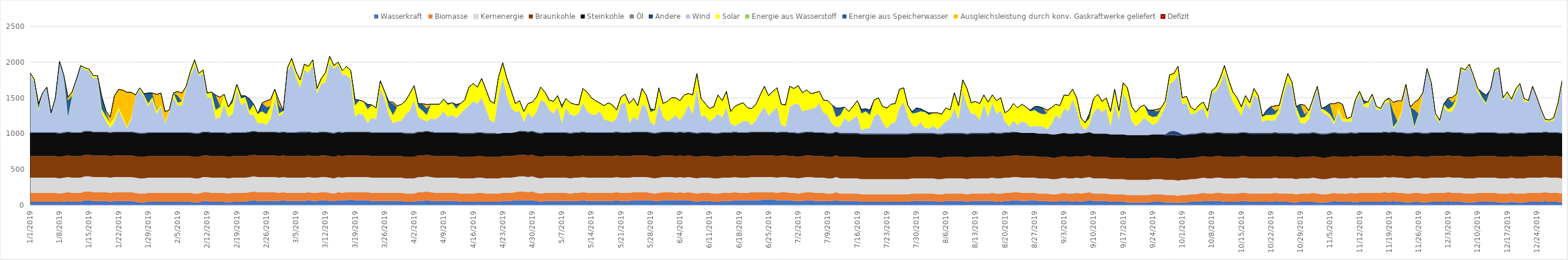
| Category | Wasserkraft | Biomasse | Kernenergie | Braunkohle | Steinkohle | Öl | Andere | Wind | Solar | Energie aus Wasserstoff | Energie aus Speicherwasser | Ausgleichsleistung durch konv. Gaskraftwerke geliefert | Defizit |
|---|---|---|---|---|---|---|---|---|---|---|---|---|---|
| 1/1/19 | 50 | 130 | 205.632 | 300.384 | 325.872 | 1.046 | 10 | 820 | 10 | 0 | 0 | 0 | 0 |
| 1/2/19 | 50 | 130 | 205.632 | 300.384 | 325.872 | 1.046 | 10 | 700 | 40 | 0 | 0 | 0 | 0 |
| 1/3/19 | 50 | 130 | 205.632 | 300.384 | 325.872 | 1.046 | 10 | 300 | 30 | 0 | 67.066 | 0 | 0 |
| 1/4/19 | 50 | 130 | 205.632 | 300.384 | 325.872 | 1.046 | 10 | 540 | 10 | 0 | 0 | 0 | 0 |
| 1/5/19 | 50 | 130 | 205.632 | 300.384 | 325.872 | 1.046 | 10 | 620 | 10 | 0 | 0 | 0 | 0 |
| 1/6/19 | 50 | 130 | 205.632 | 300.384 | 325.872 | 1.046 | 10 | 260 | 10 | 0 | 0 | 0 | 0 |
| 1/7/19 | 50 | 130 | 205.632 | 300.384 | 325.872 | 1.046 | 10 | 450 | 10 | 0 | 17.066 | 0 | 0 |
| 1/8/19 | 50 | 120 | 205.632 | 300.384 | 325.872 | 1.046 | 10 | 980 | 20 | 0 | 0 | 0 | 0 |
| 1/9/19 | 50 | 130 | 205.632 | 300.384 | 325.872 | 1.046 | 10 | 790 | 10 | 0 | 0 | 0 | 0 |
| 1/10/19 | 60 | 130 | 205.632 | 300.384 | 325.872 | 1.046 | 10 | 190 | 10 | 0 | 235.44 | 41.626 | 0 |
| 1/11/19 | 50 | 130 | 205.632 | 300.384 | 325.872 | 1.046 | 10 | 500 | 10 | 0 | 0 | 57.066 | 0 |
| 1/12/19 | 50 | 130 | 205.632 | 300.384 | 325.872 | 1.046 | 10 | 730 | 10 | 0 | 0 | 0 | 0 |
| 1/13/19 | 50 | 130 | 205.632 | 300.384 | 325.872 | 1.046 | 10 | 920 | 10 | 0 | 0 | 0 | 0 |
| 1/14/19 | 70 | 130 | 205.632 | 300.384 | 325.872 | 1.046 | 10 | 850 | 30 | 0 | 0 | 0 | 0 |
| 1/15/19 | 70 | 130 | 205.632 | 300.384 | 325.872 | 1.046 | 10 | 840 | 20 | 0 | 0 | 0 | 0 |
| 1/16/19 | 60 | 130 | 205.632 | 300.384 | 325.872 | 1.046 | 10 | 740 | 40 | 0 | 0 | 0 | 0 |
| 1/17/19 | 60 | 130 | 205.632 | 300.384 | 325.872 | 1.046 | 10 | 760 | 20 | 0 | 0 | 0 | 0 |
| 1/18/19 | 60 | 130 | 205.632 | 300.384 | 325.872 | 1.046 | 10 | 260 | 50 | 0 | 177.066 | 0 | 0 |
| 1/19/19 | 60 | 130 | 205.632 | 300.384 | 325.872 | 1.046 | 10 | 140 | 70 | 0 | 58.374 | 18.691 | 0 |
| 1/20/19 | 50 | 130 | 205.632 | 300.384 | 325.872 | 1.046 | 10 | 60 | 60 | 0 | 0 | 87.066 | 0 |
| 1/21/19 | 60 | 130 | 205.632 | 300.384 | 325.872 | 1.046 | 10 | 130 | 60 | 0 | 0 | 307.066 | 0 |
| 1/22/19 | 60 | 130 | 205.632 | 300.384 | 325.872 | 1.046 | 10 | 300 | 40 | 0 | 0 | 247.066 | 0 |
| 1/23/19 | 60 | 130 | 205.632 | 300.384 | 325.872 | 1.046 | 10 | 170 | 30 | 0 | 0 | 377.066 | 0 |
| 1/24/19 | 60 | 130 | 205.632 | 300.384 | 325.872 | 1.046 | 10 | 50 | 20 | 0 | 0 | 477.066 | 0 |
| 1/25/19 | 60 | 130 | 205.632 | 300.384 | 325.872 | 1.046 | 10 | 180 | 20 | 0 | 0 | 347.066 | 0 |
| 1/26/19 | 50 | 130 | 205.632 | 300.384 | 325.872 | 1.046 | 10 | 510 | 10 | 0 | 0 | 0 | 0 |
| 1/27/19 | 40 | 130 | 205.632 | 300.384 | 325.872 | 1.046 | 10 | 600 | 30 | 0 | 0 | 0 | 0 |
| 1/28/19 | 40 | 130 | 205.632 | 300.384 | 325.872 | 1.046 | 10 | 500 | 30 | 0 | 17.066 | 0 | 0 |
| 1/29/19 | 50 | 130 | 205.632 | 300.384 | 325.872 | 1.046 | 10 | 360 | 40 | 0 | 147.066 | 0 | 0 |
| 1/30/19 | 50 | 130 | 205.632 | 300.384 | 325.872 | 1.046 | 10 | 450 | 40 | 0 | 57.066 | 0 | 0 |
| 1/31/19 | 50 | 130 | 205.632 | 300.384 | 325.872 | 1.046 | 10 | 250 | 60 | 0 | 14.243 | 202.822 | 0 |
| 2/1/19 | 50 | 130 | 205.632 | 300.384 | 325.872 | 1.046 | 10 | 360 | 20 | 0 | 0 | 167.066 | 0 |
| 2/2/19 | 50 | 130 | 205.632 | 300.384 | 325.872 | 1.046 | 10 | 120 | 20 | 0 | 0 | 147.066 | 0 |
| 2/3/19 | 50 | 130 | 205.632 | 300.384 | 325.872 | 1.046 | 10 | 290 | 20 | 0 | 0 | 0 | 0 |
| 2/4/19 | 50 | 130 | 205.632 | 300.384 | 325.872 | 1.046 | 10 | 490 | 60 | 0 | 0 | 0 | 0 |
| 2/5/19 | 50 | 130 | 205.632 | 300.384 | 325.872 | 1.046 | 10 | 370 | 40 | 0 | 100.695 | 56.371 | 0 |
| 2/6/19 | 50 | 130 | 205.632 | 300.384 | 325.872 | 1.046 | 10 | 370 | 60 | 0 | 0 | 117.066 | 0 |
| 2/7/19 | 50 | 130 | 205.632 | 300.384 | 325.872 | 1.046 | 10 | 610 | 30 | 0 | 0 | 0 | 0 |
| 2/8/19 | 50 | 130 | 205.632 | 300.384 | 325.872 | 1.046 | 10 | 790 | 60 | 0 | 0 | 0 | 0 |
| 2/9/19 | 40 | 130 | 205.632 | 300.384 | 325.872 | 1.046 | 10 | 950 | 70 | 0 | 0 | 0 | 0 |
| 2/10/19 | 40 | 130 | 205.632 | 300.384 | 325.872 | 1.046 | 10 | 800 | 30 | 0 | 0 | 0 | 0 |
| 2/11/19 | 60 | 130 | 205.632 | 300.384 | 325.872 | 1.046 | 10 | 810 | 50 | 0 | 0 | 0 | 0 |
| 2/12/19 | 60 | 130 | 205.632 | 300.384 | 325.872 | 1.046 | 10 | 480 | 50 | 0 | 7.066 | 0 | 0 |
| 2/13/19 | 50 | 130 | 205.632 | 300.384 | 325.872 | 1.046 | 10 | 480 | 80 | 0 | 0 | 0 | 0 |
| 2/14/19 | 50 | 130 | 205.632 | 300.384 | 325.872 | 1.046 | 10 | 190 | 120 | 0 | 207.066 | 0 | 0 |
| 2/15/19 | 50 | 130 | 205.632 | 300.384 | 325.872 | 1.046 | 10 | 210 | 140 | 0 | 23.656 | 113.409 | 0 |
| 2/16/19 | 50 | 130 | 205.632 | 300.384 | 325.872 | 1.046 | 10 | 390 | 140 | 0 | 0 | 0 | 0 |
| 2/17/19 | 40 | 130 | 205.632 | 300.384 | 325.872 | 1.046 | 10 | 220 | 140 | 0 | 0 | 0 | 0 |
| 2/18/19 | 50 | 130 | 205.632 | 300.384 | 325.872 | 1.046 | 10 | 260 | 150 | 0 | 47.066 | 0 | 0 |
| 2/19/19 | 50 | 130 | 205.632 | 300.384 | 325.872 | 1.046 | 10 | 590 | 80 | 0 | 0 | 0 | 0 |
| 2/20/19 | 50 | 130 | 205.632 | 300.384 | 325.872 | 1.046 | 10 | 380 | 90 | 0 | 37.066 | 0 | 0 |
| 2/21/19 | 50 | 130 | 205.632 | 300.384 | 325.872 | 1.046 | 10 | 420 | 70 | 0 | 17.066 | 0 | 0 |
| 2/22/19 | 60 | 130 | 205.632 | 300.384 | 325.872 | 1.046 | 10 | 240 | 50 | 0 | 167.066 | 0 | 0 |
| 2/23/19 | 70 | 130 | 205.632 | 300.384 | 325.872 | 1.046 | 10 | 220 | 150 | 0 | 0 | 0 | 0 |
| 2/24/19 | 60 | 130 | 205.632 | 300.384 | 325.872 | 1.046 | 10 | 110 | 140 | 0 | 0 | 0 | 0 |
| 2/25/19 | 60 | 130 | 205.632 | 300.384 | 325.872 | 1.046 | 10 | 120 | 160 | 0 | 117.066 | 0 | 0 |
| 2/26/19 | 60 | 130 | 205.632 | 300.384 | 325.872 | 1.046 | 10 | 90 | 150 | 0 | 101.873 | 85.193 | 0 |
| 2/27/19 | 60 | 130 | 205.632 | 300.384 | 325.872 | 1.046 | 10 | 180 | 170 | 0 | 0 | 97.066 | 0 |
| 2/28/19 | 60 | 130 | 205.632 | 300.384 | 325.872 | 1.046 | 10 | 450 | 140 | 0 | 0 | 0 | 0 |
| 3/1/19 | 60 | 120 | 205.632 | 300.384 | 325.872 | 1.046 | 10 | 220 | 40 | 0 | 114.348 | 62.718 | 0 |
| 3/2/19 | 70 | 120 | 205.632 | 300.384 | 325.872 | 1.046 | 10 | 250 | 40 | 0 | 0 | 0 | 0 |
| 3/3/19 | 60 | 120 | 205.632 | 300.384 | 325.872 | 1.046 | 10 | 850 | 50 | 0 | 0 | 0 | 0 |
| 3/4/19 | 60 | 120 | 205.632 | 300.384 | 325.872 | 1.046 | 10 | 960 | 70 | 0 | 0 | 0 | 0 |
| 3/5/19 | 60 | 120 | 205.632 | 300.384 | 325.872 | 1.046 | 10 | 770 | 80 | 0 | 0 | 0 | 0 |
| 3/6/19 | 60 | 120 | 205.632 | 300.384 | 325.872 | 1.046 | 20 | 610 | 110 | 0 | 0 | 0 | 0 |
| 3/7/19 | 60 | 120 | 205.632 | 300.384 | 325.872 | 1.046 | 20 | 860 | 80 | 0 | 0 | 0 | 0 |
| 3/8/19 | 70 | 120 | 205.632 | 300.384 | 325.872 | 1.046 | 10 | 820 | 90 | 0 | 0 | 0 | 0 |
| 3/9/19 | 60 | 120 | 205.632 | 300.384 | 325.872 | 1.046 | 10 | 940 | 70 | 0 | 0 | 0 | 0 |
| 3/10/19 | 60 | 120 | 205.632 | 300.384 | 325.872 | 1.046 | 10 | 550 | 60 | 0 | 0 | 0 | 0 |
| 3/11/19 | 70 | 120 | 205.632 | 300.384 | 325.872 | 1.046 | 10 | 660 | 80 | 0 | 0 | 0 | 0 |
| 3/12/19 | 70 | 120 | 205.632 | 300.384 | 325.872 | 1.046 | 10 | 690 | 130 | 0 | 0 | 0 | 0 |
| 3/13/19 | 60 | 120 | 205.632 | 300.384 | 325.872 | 1.046 | 10 | 970 | 90 | 0 | 0 | 0 | 0 |
| 3/14/19 | 60 | 110 | 205.632 | 300.384 | 325.872 | 1.046 | 10 | 900 | 40 | 0 | 0 | 0 | 0 |
| 3/15/19 | 70 | 120 | 205.632 | 300.384 | 325.872 | 1.046 | 10 | 930 | 40 | 0 | 0 | 0 | 0 |
| 3/16/19 | 70 | 110 | 205.632 | 300.384 | 325.872 | 1.046 | 10 | 800 | 60 | 0 | 0 | 0 | 0 |
| 3/17/19 | 70 | 120 | 205.632 | 300.384 | 325.872 | 1.046 | 10 | 790 | 120 | 0 | 0 | 0 | 0 |
| 3/18/19 | 80 | 110 | 205.632 | 300.384 | 325.872 | 1.046 | 10 | 730 | 120 | 0 | 0 | 0 | 0 |
| 3/19/19 | 70 | 120 | 205.632 | 300.384 | 325.872 | 1.046 | 10 | 210 | 150 | 0 | 87.066 | 0 | 0 |
| 3/20/19 | 70 | 120 | 205.632 | 300.384 | 325.872 | 1.046 | 10 | 250 | 180 | 0 | 7.066 | 0 | 0 |
| 3/21/19 | 70 | 120 | 205.632 | 300.384 | 325.872 | 1.046 | 10 | 230 | 190 | 0 | 0 | 0 | 0 |
| 3/22/19 | 70 | 120 | 205.632 | 300.384 | 325.872 | 1.046 | 10 | 120 | 190 | 0 | 67.066 | 0 | 0 |
| 3/23/19 | 60 | 120 | 205.632 | 300.384 | 325.872 | 1.046 | 10 | 200 | 180 | 0 | 0 | 0 | 0 |
| 3/24/19 | 60 | 120 | 205.632 | 300.384 | 325.872 | 1.046 | 10 | 180 | 160 | 0 | 0 | 0 | 0 |
| 3/25/19 | 60 | 120 | 205.632 | 300.384 | 325.872 | 1.046 | 10 | 600 | 120 | 0 | 0 | 0 | 0 |
| 3/26/19 | 60 | 120 | 205.632 | 300.384 | 325.872 | 1.046 | 10 | 470 | 100 | 0 | 0 | 0 | 0 |
| 3/27/19 | 60 | 120 | 205.632 | 300.384 | 325.872 | 1.046 | 10 | 250 | 100 | 0 | 77.066 | 0 | 0 |
| 3/28/19 | 60 | 120 | 205.632 | 300.384 | 325.872 | 1.046 | 10 | 120 | 120 | 0 | 158.374 | 18.691 | 0 |
| 3/29/19 | 60 | 120 | 205.632 | 300.384 | 325.872 | 1.046 | 10 | 150 | 200 | 0 | 0 | 17.066 | 0 |
| 3/30/19 | 60 | 120 | 205.632 | 300.384 | 325.872 | 1.046 | 10 | 160 | 230 | 0 | 0 | 0 | 0 |
| 3/31/19 | 50 | 120 | 205.632 | 300.384 | 325.872 | 1.046 | 10 | 260 | 190 | 0 | 0 | 0 | 0 |
| 4/1/19 | 50 | 120 | 205.632 | 300.384 | 325.872 | 1.046 | 10 | 310 | 240 | 0 | 0 | 0 | 0 |
| 4/2/19 | 50 | 120 | 205.632 | 300.384 | 325.872 | 1.046 | 10 | 460 | 200 | 0 | 0 | 0 | 0 |
| 4/3/19 | 60 | 130 | 205.632 | 300.384 | 325.872 | 1.046 | 10 | 200 | 140 | 0 | 47.066 | 0 | 0 |
| 4/4/19 | 60 | 130 | 205.632 | 300.384 | 325.872 | 1.046 | 10 | 170 | 120 | 0 | 97.066 | 0 | 0 |
| 4/5/19 | 70 | 130 | 205.632 | 300.384 | 325.872 | 1.046 | 10 | 130 | 90 | 0 | 91.309 | 55.757 | 0 |
| 4/6/19 | 60 | 130 | 205.632 | 300.384 | 325.872 | 1.046 | 10 | 180 | 200 | 0 | 0 | 0 | 0 |
| 4/7/19 | 60 | 120 | 205.632 | 300.384 | 325.872 | 1.046 | 10 | 180 | 210 | 0 | 0 | 0 | 0 |
| 4/8/19 | 60 | 120 | 205.632 | 300.384 | 325.872 | 1.046 | 10 | 220 | 170 | 0 | 0 | 0 | 0 |
| 4/9/19 | 60 | 120 | 205.632 | 300.384 | 325.872 | 1.046 | 10 | 290 | 170 | 0 | 0 | 0 | 0 |
| 4/10/19 | 60 | 120 | 205.632 | 300.384 | 325.872 | 1.046 | 10 | 210 | 170 | 0 | 17.066 | 0 | 0 |
| 4/11/19 | 60 | 120 | 205.632 | 300.384 | 325.872 | 1.046 | 10 | 240 | 170 | 0 | 0 | 0 | 0 |
| 4/12/19 | 60 | 120 | 205.632 | 300.384 | 325.872 | 1.046 | 10 | 200 | 130 | 0 | 57.066 | 0 | 0 |
| 4/13/19 | 50 | 120 | 205.632 | 300.384 | 325.872 | 1.046 | 10 | 270 | 140 | 0 | 0 | 0 | 0 |
| 4/14/19 | 50 | 120 | 205.632 | 300.384 | 325.872 | 1.046 | 10 | 330 | 130 | 0 | 0 | 0 | 0 |
| 4/15/19 | 50 | 120 | 205.632 | 300.384 | 325.872 | 1.046 | 10 | 380 | 260 | 0 | 0 | 0 | 0 |
| 4/16/19 | 50 | 120 | 205.632 | 300.384 | 325.872 | 1.046 | 10 | 440 | 250 | 0 | 0 | 0 | 0 |
| 4/17/19 | 50 | 130 | 205.632 | 300.384 | 325.872 | 1.046 | 10 | 400 | 230 | 0 | 0 | 0 | 0 |
| 4/18/19 | 50 | 130 | 205.632 | 300.384 | 325.872 | 1.046 | 10 | 480 | 270 | 0 | 0 | 0 | 0 |
| 4/19/19 | 50 | 120 | 205.632 | 300.384 | 325.872 | 1.046 | 10 | 340 | 270 | 0 | 0 | 0 | 0 |
| 4/20/19 | 50 | 120 | 205.632 | 300.384 | 325.872 | 1.046 | 10 | 180 | 270 | 0 | 0 | 0 | 0 |
| 4/21/19 | 50 | 120 | 205.632 | 300.384 | 325.872 | 1.046 | 10 | 140 | 270 | 0 | 0 | 0 | 0 |
| 4/22/19 | 50 | 120 | 205.632 | 300.384 | 325.872 | 1.046 | 0 | 520 | 270 | 0 | 0 | 0 | 0 |
| 4/23/19 | 60 | 120 | 205.632 | 300.384 | 325.872 | 1.046 | 0 | 770 | 210 | 0 | 0 | 0 | 0 |
| 4/24/19 | 60 | 120 | 205.632 | 300.384 | 325.872 | 1.046 | 0 | 520 | 240 | 0 | 0 | 0 | 0 |
| 4/25/19 | 60 | 120 | 205.632 | 300.384 | 325.872 | 1.046 | 0 | 350 | 240 | 0 | 0 | 0 | 0 |
| 4/26/19 | 70 | 120 | 205.632 | 300.384 | 325.872 | 1.046 | 0 | 280 | 120 | 0 | 0 | 0 | 0 |
| 4/27/19 | 70 | 130 | 205.632 | 300.384 | 325.872 | 1.046 | 10 | 280 | 140 | 0 | 0 | 0 | 0 |
| 4/28/19 | 70 | 130 | 205.632 | 300.384 | 325.872 | 1.046 | 10 | 120 | 150 | 0 | 0 | 0 | 0 |
| 4/29/19 | 70 | 120 | 205.632 | 300.384 | 325.872 | 1.046 | 10 | 270 | 120 | 0 | 0 | 0 | 0 |
| 4/30/19 | 70 | 130 | 205.632 | 300.384 | 325.872 | 1.046 | 10 | 180 | 220 | 0 | 0 | 0 | 0 |
| 5/1/19 | 60 | 120 | 205.632 | 300.384 | 325.872 | 1.046 | 10 | 280 | 210 | 0 | 0 | 0 | 0 |
| 5/2/19 | 50 | 120 | 205.632 | 300.384 | 325.872 | 1.046 | 10 | 460 | 180 | 0 | 0 | 0 | 0 |
| 5/3/19 | 60 | 120 | 205.632 | 300.384 | 325.872 | 1.046 | 10 | 420 | 140 | 0 | 0 | 0 | 0 |
| 5/4/19 | 60 | 120 | 205.632 | 300.384 | 325.872 | 1.046 | 10 | 320 | 130 | 0 | 0 | 0 | 0 |
| 5/5/19 | 60 | 120 | 205.632 | 300.384 | 325.872 | 1.046 | 10 | 260 | 170 | 0 | 0 | 0 | 0 |
| 5/6/19 | 60 | 120 | 205.632 | 300.384 | 325.872 | 1.046 | 10 | 350 | 160 | 0 | 0 | 0 | 0 |
| 5/7/19 | 60 | 120 | 205.632 | 300.384 | 325.872 | 1.046 | 10 | 130 | 200 | 0 | 37.066 | 0 | 0 |
| 5/8/19 | 60 | 120 | 205.632 | 300.384 | 325.872 | 1.046 | 10 | 340 | 130 | 0 | 0 | 0 | 0 |
| 5/9/19 | 60 | 110 | 205.632 | 300.384 | 325.872 | 1.046 | 10 | 260 | 160 | 0 | 0 | 0 | 0 |
| 5/10/19 | 60 | 120 | 205.632 | 300.384 | 325.872 | 1.046 | 10 | 230 | 160 | 0 | 0 | 0 | 0 |
| 5/11/19 | 60 | 120 | 205.632 | 300.384 | 325.872 | 1.046 | 10 | 260 | 120 | 0 | 0 | 0 | 0 |
| 5/12/19 | 70 | 120 | 205.632 | 300.384 | 325.872 | 1.046 | 10 | 400 | 200 | 0 | 0 | 0 | 0 |
| 5/13/19 | 60 | 120 | 205.632 | 300.384 | 325.872 | 1.046 | 10 | 290 | 270 | 0 | 0 | 0 | 0 |
| 5/14/19 | 60 | 120 | 205.632 | 300.384 | 325.872 | 1.046 | 10 | 250 | 230 | 0 | 0 | 0 | 0 |
| 5/15/19 | 60 | 120 | 205.632 | 300.384 | 325.872 | 1.046 | 10 | 240 | 200 | 0 | 0 | 0 | 0 |
| 5/16/19 | 60 | 120 | 205.632 | 300.384 | 325.872 | 1.046 | 10 | 290 | 110 | 0 | 7.066 | 0 | 0 |
| 5/17/19 | 60 | 120 | 205.632 | 300.384 | 325.872 | 1.046 | 10 | 180 | 190 | 0 | 0 | 0 | 0 |
| 5/18/19 | 60 | 120 | 205.632 | 300.384 | 325.872 | 1.046 | 10 | 160 | 250 | 0 | 0 | 0 | 0 |
| 5/19/19 | 60 | 120 | 205.632 | 300.384 | 325.872 | 1.046 | 10 | 140 | 240 | 0 | 0 | 0 | 0 |
| 5/20/19 | 70 | 120 | 205.632 | 300.384 | 325.872 | 1.046 | 10 | 190 | 110 | 0 | 0 | 0 | 0 |
| 5/21/19 | 60 | 120 | 205.632 | 300.384 | 325.872 | 1.046 | 10 | 390 | 100 | 0 | 0 | 0 | 0 |
| 5/22/19 | 60 | 120 | 205.632 | 300.384 | 325.872 | 1.046 | 10 | 420 | 110 | 0 | 0 | 0 | 0 |
| 5/23/19 | 60 | 120 | 205.632 | 300.384 | 325.872 | 1.046 | 10 | 130 | 270 | 0 | 0 | 0 | 0 |
| 5/24/19 | 70 | 120 | 205.632 | 300.384 | 325.872 | 1.046 | 10 | 200 | 260 | 0 | 0 | 0 | 0 |
| 5/25/19 | 70 | 120 | 205.632 | 300.384 | 325.872 | 1.046 | 10 | 160 | 200 | 0 | 0 | 0 | 0 |
| 5/26/19 | 70 | 120 | 205.632 | 300.384 | 325.872 | 1.046 | 10 | 380 | 220 | 0 | 0 | 0 | 0 |
| 5/27/19 | 70 | 120 | 205.632 | 300.384 | 325.872 | 1.046 | 10 | 340 | 170 | 0 | 0 | 0 | 0 |
| 5/28/19 | 70 | 110 | 205.632 | 300.384 | 325.872 | 1.046 | 10 | 140 | 140 | 0 | 47.066 | 0 | 0 |
| 5/29/19 | 60 | 110 | 205.632 | 300.384 | 325.872 | 1.046 | 10 | 110 | 210 | 0 | 0 | 0 | 0 |
| 5/30/19 | 60 | 120 | 205.632 | 300.384 | 325.872 | 1.046 | 10 | 400 | 220 | 0 | 0 | 0 | 0 |
| 5/31/19 | 70 | 120 | 205.632 | 300.384 | 325.872 | 1.046 | 10 | 200 | 190 | 0 | 0 | 0 | 0 |
| 6/1/19 | 70 | 120 | 205.632 | 300.384 | 325.872 | 1.046 | 10 | 140 | 280 | 0 | 0 | 0 | 0 |
| 6/2/19 | 70 | 120 | 205.632 | 300.384 | 325.872 | 1.046 | 10 | 180 | 290 | 0 | 0 | 0 | 0 |
| 6/3/19 | 70 | 110 | 205.632 | 300.384 | 325.872 | 1.046 | 10 | 240 | 240 | 0 | 0 | 0 | 0 |
| 6/4/19 | 70 | 120 | 205.632 | 300.384 | 325.872 | 1.046 | 10 | 160 | 270 | 0 | 0 | 0 | 0 |
| 6/5/19 | 70 | 110 | 205.632 | 300.384 | 325.872 | 1.046 | 10 | 250 | 270 | 0 | 0 | 0 | 0 |
| 6/6/19 | 70 | 120 | 205.632 | 300.384 | 325.872 | 1.046 | 10 | 380 | 150 | 0 | 0 | 0 | 0 |
| 6/7/19 | 60 | 120 | 205.632 | 300.384 | 325.872 | 1.046 | 10 | 250 | 270 | 0 | 0 | 0 | 0 |
| 6/8/19 | 50 | 120 | 205.632 | 300.384 | 325.872 | 1.046 | 10 | 620 | 210 | 0 | 0 | 0 | 0 |
| 6/9/19 | 60 | 120 | 205.632 | 300.384 | 325.872 | 1.046 | 10 | 220 | 250 | 0 | 0 | 0 | 0 |
| 6/10/19 | 60 | 120 | 205.632 | 300.384 | 325.872 | 1.046 | 10 | 230 | 170 | 0 | 0 | 0 | 0 |
| 6/11/19 | 60 | 120 | 205.632 | 300.384 | 325.872 | 1.046 | 10 | 150 | 180 | 0 | 0 | 0 | 0 |
| 6/12/19 | 50 | 120 | 205.632 | 300.384 | 325.872 | 1.046 | 10 | 200 | 160 | 0 | 7.066 | 0 | 0 |
| 6/13/19 | 50 | 120 | 205.632 | 300.384 | 325.872 | 1.046 | 10 | 270 | 260 | 0 | 0 | 0 | 0 |
| 6/14/19 | 60 | 120 | 205.632 | 300.384 | 325.872 | 1.046 | 10 | 200 | 240 | 0 | 0 | 0 | 0 |
| 6/15/19 | 60 | 120 | 205.632 | 300.384 | 325.872 | 1.046 | 10 | 350 | 220 | 0 | 0 | 0 | 0 |
| 6/16/19 | 60 | 120 | 205.632 | 300.384 | 325.872 | 1.046 | 10 | 120 | 170 | 0 | 0 | 0 | 0 |
| 6/17/19 | 70 | 120 | 205.632 | 300.384 | 325.872 | 1.046 | 10 | 80 | 270 | 0 | 0 | 0 | 0 |
| 6/18/19 | 70 | 110 | 205.632 | 300.384 | 325.872 | 1.046 | 10 | 120 | 270 | 0 | 0 | 0 | 0 |
| 6/19/19 | 70 | 110 | 205.632 | 300.384 | 325.872 | 1.046 | 10 | 150 | 260 | 0 | 0 | 0 | 0 |
| 6/20/19 | 70 | 110 | 205.632 | 300.384 | 325.872 | 1.046 | 10 | 160 | 180 | 0 | 0 | 0 | 0 |
| 6/21/19 | 70 | 120 | 205.632 | 300.384 | 325.872 | 1.046 | 10 | 90 | 230 | 0 | 0 | 0 | 0 |
| 6/22/19 | 70 | 120 | 205.632 | 300.384 | 325.872 | 1.046 | 10 | 160 | 220 | 0 | 0 | 0 | 0 |
| 6/23/19 | 70 | 120 | 205.632 | 300.384 | 325.872 | 1.046 | 10 | 260 | 250 | 0 | 0 | 0 | 0 |
| 6/24/19 | 80 | 110 | 205.632 | 300.384 | 325.872 | 1.046 | 10 | 340 | 290 | 0 | 0 | 0 | 0 |
| 6/25/19 | 80 | 110 | 205.632 | 300.384 | 325.872 | 1.046 | 10 | 220 | 280 | 0 | 0 | 0 | 0 |
| 6/26/19 | 80 | 110 | 205.632 | 300.384 | 325.872 | 1.046 | 10 | 280 | 280 | 0 | 0 | 0 | 0 |
| 6/27/19 | 70 | 110 | 205.632 | 300.384 | 325.872 | 1.046 | 10 | 350 | 270 | 0 | 0 | 0 | 0 |
| 6/28/19 | 70 | 120 | 205.632 | 300.384 | 325.872 | 1.046 | 10 | 90 | 290 | 0 | 0 | 0 | 0 |
| 6/29/19 | 70 | 120 | 205.632 | 300.384 | 325.872 | 1.046 | 10 | 70 | 300 | 0 | 0 | 0 | 0 |
| 6/30/19 | 70 | 110 | 205.632 | 300.384 | 325.872 | 1.046 | 10 | 350 | 290 | 0 | 0 | 0 | 0 |
| 7/1/19 | 60 | 120 | 205.632 | 300.384 | 325.872 | 1.046 | 10 | 390 | 220 | 0 | 0 | 0 | 0 |
| 7/2/19 | 60 | 110 | 205.632 | 300.384 | 325.872 | 1.046 | 10 | 410 | 250 | 0 | 0 | 0 | 0 |
| 7/3/19 | 60 | 120 | 205.632 | 300.384 | 325.872 | 1.046 | 10 | 290 | 260 | 0 | 0 | 0 | 0 |
| 7/4/19 | 70 | 120 | 205.632 | 300.384 | 325.872 | 1.046 | 10 | 300 | 280 | 0 | 0 | 0 | 0 |
| 7/5/19 | 70 | 120 | 205.632 | 300.384 | 325.872 | 1.046 | 10 | 310 | 220 | 0 | 0 | 0 | 0 |
| 7/6/19 | 60 | 120 | 205.632 | 300.384 | 325.872 | 1.046 | 10 | 340 | 210 | 0 | 0 | 0 | 0 |
| 7/7/19 | 60 | 120 | 205.632 | 300.384 | 325.872 | 1.046 | 10 | 400 | 170 | 0 | 0 | 0 | 0 |
| 7/8/19 | 60 | 120 | 205.632 | 300.384 | 325.872 | 1.046 | 10 | 270 | 180 | 0 | 0 | 0 | 0 |
| 7/9/19 | 60 | 110 | 205.632 | 300.384 | 325.872 | 1.046 | 10 | 250 | 200 | 0 | 0 | 0 | 0 |
| 7/10/19 | 60 | 110 | 205.632 | 300.384 | 325.872 | 1.046 | 10 | 130 | 260 | 0 | 0 | 0 | 0 |
| 7/11/19 | 70 | 120 | 205.632 | 300.384 | 325.872 | 1.046 | 10 | 60 | 140 | 0 | 127.066 | 0 | 0 |
| 7/12/19 | 60 | 110 | 205.632 | 300.384 | 325.872 | 1.046 | 10 | 90 | 160 | 0 | 97.066 | 0 | 0 |
| 7/13/19 | 60 | 110 | 205.632 | 300.384 | 325.872 | 1.046 | 10 | 210 | 150 | 0 | 0 | 0 | 0 |
| 7/14/19 | 60 | 110 | 205.632 | 300.384 | 325.872 | 1.046 | 10 | 150 | 150 | 0 | 0 | 0 | 0 |
| 7/15/19 | 60 | 110 | 205.632 | 300.384 | 325.872 | 1.046 | 10 | 200 | 170 | 0 | 0 | 0 | 0 |
| 7/16/19 | 60 | 110 | 205.632 | 300.384 | 325.872 | 1.046 | 10 | 240 | 210 | 0 | 0 | 0 | 0 |
| 7/17/19 | 50 | 110 | 205.632 | 300.384 | 325.872 | 1.046 | 10 | 50 | 230 | 0 | 57.066 | 0 | 0 |
| 7/18/19 | 50 | 110 | 205.632 | 300.384 | 325.872 | 1.046 | 10 | 70 | 240 | 0 | 37.066 | 0 | 0 |
| 7/19/19 | 50 | 110 | 205.632 | 300.384 | 325.872 | 1.046 | 10 | 80 | 180 | 0 | 67.066 | 0 | 0 |
| 7/20/19 | 50 | 110 | 205.632 | 300.384 | 325.872 | 1.046 | 10 | 240 | 230 | 0 | 0 | 0 | 0 |
| 7/21/19 | 50 | 110 | 205.632 | 300.384 | 325.872 | 1.046 | 10 | 280 | 220 | 0 | 0 | 0 | 0 |
| 7/22/19 | 50 | 110 | 205.632 | 300.384 | 325.872 | 1.046 | 10 | 160 | 220 | 0 | 0 | 0 | 0 |
| 7/23/19 | 50 | 110 | 205.632 | 300.384 | 325.872 | 1.046 | 10 | 70 | 280 | 0 | 7.066 | 0 | 0 |
| 7/24/19 | 50 | 110 | 205.632 | 300.384 | 325.872 | 1.046 | 10 | 140 | 270 | 0 | 0 | 0 | 0 |
| 7/25/19 | 50 | 110 | 205.632 | 300.384 | 325.872 | 1.046 | 10 | 160 | 260 | 0 | 0 | 0 | 0 |
| 7/26/19 | 50 | 110 | 205.632 | 300.384 | 325.872 | 1.046 | 10 | 360 | 260 | 0 | 0 | 0 | 0 |
| 7/27/19 | 50 | 110 | 205.632 | 300.384 | 325.872 | 1.046 | 10 | 440 | 200 | 0 | 0 | 0 | 0 |
| 7/28/19 | 50 | 110 | 205.632 | 300.384 | 325.872 | 1.046 | 10 | 240 | 150 | 0 | 0 | 0 | 0 |
| 7/29/19 | 60 | 110 | 205.632 | 300.384 | 325.872 | 1.046 | 10 | 110 | 160 | 0 | 27.066 | 0 | 0 |
| 7/30/19 | 60 | 110 | 205.632 | 300.384 | 325.872 | 1.046 | 10 | 80 | 200 | 0 | 67.066 | 0 | 0 |
| 7/31/19 | 60 | 110 | 205.632 | 300.384 | 325.872 | 1.046 | 10 | 150 | 150 | 0 | 37.066 | 0 | 0 |
| 8/1/19 | 60 | 110 | 205.632 | 300.384 | 325.872 | 1.046 | 10 | 70 | 220 | 0 | 17.066 | 0 | 0 |
| 8/2/19 | 60 | 110 | 205.632 | 300.384 | 325.872 | 1.046 | 10 | 60 | 190 | 0 | 27.066 | 0 | 0 |
| 8/3/19 | 60 | 110 | 205.632 | 300.384 | 325.872 | 1.046 | 10 | 100 | 180 | 0 | 0 | 0 | 0 |
| 8/4/19 | 50 | 110 | 205.632 | 300.384 | 325.872 | 1.046 | 10 | 60 | 230 | 0 | 0 | 0 | 0 |
| 8/5/19 | 50 | 110 | 205.632 | 300.384 | 325.872 | 1.046 | 10 | 110 | 160 | 0 | 0 | 0 | 0 |
| 8/6/19 | 60 | 110 | 205.632 | 300.384 | 325.872 | 1.046 | 10 | 160 | 190 | 0 | 0 | 0 | 0 |
| 8/7/19 | 60 | 110 | 205.632 | 300.384 | 325.872 | 1.046 | 10 | 200 | 120 | 0 | 0 | 0 | 0 |
| 8/8/19 | 60 | 110 | 205.632 | 300.384 | 325.872 | 1.046 | 10 | 340 | 220 | 0 | 0 | 0 | 0 |
| 8/9/19 | 60 | 110 | 205.632 | 300.384 | 325.872 | 1.046 | 10 | 190 | 190 | 0 | 0 | 0 | 0 |
| 8/10/19 | 60 | 110 | 205.632 | 300.384 | 325.872 | 1.046 | 10 | 590 | 150 | 0 | 0 | 0 | 0 |
| 8/11/19 | 50 | 110 | 205.632 | 300.384 | 325.872 | 1.046 | 10 | 400 | 230 | 0 | 0 | 0 | 0 |
| 8/12/19 | 60 | 110 | 205.632 | 300.384 | 325.872 | 1.046 | 10 | 270 | 150 | 0 | 0 | 0 | 0 |
| 8/13/19 | 60 | 110 | 205.632 | 300.384 | 325.872 | 1.046 | 10 | 260 | 180 | 0 | 0 | 0 | 0 |
| 8/14/19 | 60 | 110 | 205.632 | 300.384 | 325.872 | 1.046 | 10 | 180 | 230 | 0 | 0 | 0 | 0 |
| 8/15/19 | 60 | 110 | 205.632 | 300.384 | 325.872 | 1.046 | 10 | 400 | 130 | 0 | 0 | 0 | 0 |
| 8/16/19 | 60 | 110 | 205.632 | 300.384 | 325.872 | 1.046 | 10 | 220 | 210 | 0 | 0 | 0 | 0 |
| 8/17/19 | 60 | 120 | 205.632 | 300.384 | 325.872 | 1.046 | 10 | 410 | 110 | 0 | 0 | 0 | 0 |
| 8/18/19 | 50 | 120 | 205.632 | 300.384 | 325.872 | 1.046 | 10 | 270 | 180 | 0 | 0 | 0 | 0 |
| 8/19/19 | 50 | 120 | 205.632 | 300.384 | 325.872 | 1.046 | 10 | 310 | 180 | 0 | 0 | 0 | 0 |
| 8/20/19 | 60 | 120 | 205.632 | 300.384 | 325.872 | 1.046 | 10 | 150 | 120 | 0 | 0 | 0 | 0 |
| 8/21/19 | 60 | 120 | 205.632 | 300.384 | 325.872 | 1.046 | 10 | 80 | 230 | 0 | 0 | 0 | 0 |
| 8/22/19 | 70 | 120 | 205.632 | 300.384 | 325.872 | 1.046 | 10 | 150 | 240 | 0 | 0 | 0 | 0 |
| 8/23/19 | 70 | 120 | 205.632 | 300.384 | 325.872 | 1.046 | 0 | 100 | 240 | 0 | 0 | 0 | 0 |
| 8/24/19 | 60 | 120 | 205.632 | 300.384 | 325.872 | 1.046 | 0 | 160 | 240 | 0 | 0 | 0 | 0 |
| 8/25/19 | 60 | 120 | 205.632 | 300.384 | 325.872 | 1.046 | 0 | 140 | 220 | 0 | 0 | 0 | 0 |
| 8/26/19 | 70 | 110 | 205.632 | 300.384 | 325.872 | 1.046 | 0 | 80 | 220 | 0 | 17.066 | 0 | 0 |
| 8/27/19 | 70 | 110 | 205.632 | 300.384 | 325.872 | 1.046 | 0 | 100 | 220 | 0 | 47.066 | 0 | 0 |
| 8/28/19 | 60 | 110 | 205.632 | 300.384 | 325.872 | 1.046 | 0 | 100 | 190 | 0 | 87.066 | 0 | 0 |
| 8/29/19 | 60 | 110 | 205.632 | 300.384 | 325.872 | 1.046 | 0 | 100 | 170 | 0 | 84.243 | 2.822 | 0 |
| 8/30/19 | 60 | 110 | 205.632 | 300.384 | 325.872 | 1.046 | 0 | 60 | 220 | 0 | 0 | 47.066 | 0 |
| 8/31/19 | 50 | 110 | 205.632 | 300.384 | 325.872 | 1.046 | 0 | 140 | 230 | 0 | 0 | 0 | 0 |
| 9/1/19 | 50 | 110 | 205.632 | 300.384 | 325.872 | 1.046 | 0 | 270 | 150 | 0 | 0 | 0 | 0 |
| 9/2/19 | 60 | 110 | 205.632 | 300.384 | 325.872 | 1.046 | 0 | 210 | 180 | 0 | 0 | 0 | 0 |
| 9/3/19 | 60 | 120 | 205.632 | 300.384 | 325.872 | 1.046 | 0 | 340 | 190 | 0 | 0 | 0 | 0 |
| 9/4/19 | 60 | 110 | 205.632 | 300.384 | 325.872 | 1.046 | 0 | 310 | 220 | 0 | 0 | 0 | 0 |
| 9/5/19 | 50 | 120 | 205.632 | 300.384 | 325.872 | 1.046 | 0 | 480 | 140 | 0 | 0 | 0 | 0 |
| 9/6/19 | 60 | 120 | 205.632 | 300.384 | 325.872 | 1.046 | 0 | 320 | 170 | 0 | 0 | 0 | 0 |
| 9/7/19 | 50 | 120 | 205.632 | 300.384 | 325.872 | 1.046 | 0 | 120 | 100 | 0 | 0 | 0 | 0 |
| 9/8/19 | 60 | 120 | 205.632 | 300.384 | 325.872 | 1.046 | 0 | 40 | 100 | 0 | 0 | 0 | 0 |
| 9/9/19 | 70 | 120 | 205.632 | 300.384 | 325.872 | 1.046 | 0 | 110 | 80 | 0 | 67.066 | 0 | 0 |
| 9/10/19 | 60 | 110 | 205.632 | 300.384 | 325.872 | 1.046 | 0 | 300 | 190 | 0 | 0 | 0 | 0 |
| 9/11/19 | 60 | 110 | 205.632 | 300.384 | 325.872 | 1.046 | 0 | 360 | 190 | 0 | 0 | 0 | 0 |
| 9/12/19 | 60 | 110 | 205.632 | 300.384 | 325.872 | 1.046 | 0 | 300 | 150 | 0 | 0 | 0 | 0 |
| 9/13/19 | 60 | 110 | 205.632 | 300.384 | 325.872 | 1.046 | 0 | 350 | 150 | 0 | 0 | 0 | 0 |
| 9/14/19 | 50 | 110 | 205.632 | 300.384 | 325.872 | 1.046 | 0 | 110 | 210 | 0 | 0 | 0 | 0 |
| 9/15/19 | 50 | 110 | 205.632 | 300.384 | 325.872 | 1.046 | 0 | 430 | 200 | 0 | 0 | 0 | 0 |
| 9/16/19 | 50 | 110 | 205.632 | 300.384 | 325.872 | 1.046 | 0 | 200 | 120 | 0 | 7.066 | 0 | 0 |
| 9/17/19 | 50 | 110 | 205.632 | 300.384 | 325.872 | 1.046 | 0 | 580 | 140 | 0 | 0 | 0 | 0 |
| 9/18/19 | 40 | 110 | 205.632 | 300.384 | 325.872 | 1.046 | 0 | 470 | 190 | 0 | 0 | 0 | 0 |
| 9/19/19 | 40 | 110 | 205.632 | 300.384 | 325.872 | 1.046 | 0 | 200 | 200 | 0 | 0 | 0 | 0 |
| 9/20/19 | 40 | 110 | 205.632 | 300.384 | 325.872 | 1.046 | 0 | 120 | 190 | 0 | 7.066 | 0 | 0 |
| 9/21/19 | 40 | 110 | 205.632 | 300.384 | 325.872 | 1.046 | 0 | 170 | 220 | 0 | 0 | 0 | 0 |
| 9/22/19 | 40 | 110 | 205.632 | 300.384 | 325.872 | 1.046 | 0 | 240 | 180 | 0 | 0 | 0 | 0 |
| 9/23/19 | 40 | 110 | 205.632 | 300.384 | 325.872 | 1.046 | 0 | 190 | 90 | 0 | 67.066 | 0 | 0 |
| 9/24/19 | 50 | 110 | 205.632 | 300.384 | 325.872 | 1.046 | 0 | 130 | 110 | 0 | 97.066 | 0 | 0 |
| 9/25/19 | 50 | 110 | 205.632 | 300.384 | 325.872 | 1.046 | 0 | 160 | 90 | 0 | 71.309 | 25.757 | 0 |
| 9/26/19 | 50 | 110 | 205.632 | 300.384 | 325.872 | 1.046 | 0 | 270 | 80 | 0 | 0 | 17.066 | 0 |
| 9/27/19 | 40 | 110 | 205.632 | 300.384 | 325.872 | 1.046 | 10 | 390 | 80 | 0 | 0 | 0 | 0 |
| 9/28/19 | 40 | 110 | 205.632 | 300.384 | 325.872 | 1.046 | 50 | 670 | 120 | 0 | 0 | 0 | 0 |
| 9/29/19 | 40 | 110 | 205.632 | 300.384 | 325.872 | 1.046 | 60 | 690 | 110 | 0 | 0 | 0 | 0 |
| 9/30/19 | 30 | 110 | 205.632 | 300.384 | 325.872 | 1.046 | 50 | 810 | 110 | 0 | 0 | 0 | 0 |
| 10/1/19 | 40 | 110 | 205.632 | 300.384 | 325.872 | 1.046 | 10 | 420 | 90 | 0 | 0 | 0 | 0 |
| 10/2/19 | 40 | 110 | 205.632 | 300.384 | 325.872 | 1.046 | 10 | 440 | 90 | 0 | 0 | 0 | 0 |
| 10/3/19 | 50 | 110 | 205.632 | 300.384 | 325.872 | 1.046 | 10 | 270 | 100 | 0 | 0 | 0 | 0 |
| 10/4/19 | 50 | 110 | 205.632 | 300.384 | 325.872 | 1.046 | 10 | 280 | 50 | 0 | 0 | 0 | 0 |
| 10/5/19 | 50 | 120 | 205.632 | 300.384 | 325.872 | 1.046 | 10 | 320 | 70 | 0 | 0 | 0 | 0 |
| 10/6/19 | 60 | 120 | 205.632 | 300.384 | 325.872 | 1.046 | 10 | 340 | 80 | 0 | 0 | 0 | 0 |
| 10/7/19 | 60 | 110 | 205.632 | 300.384 | 325.872 | 1.046 | 10 | 190 | 110 | 0 | 7.066 | 0 | 0 |
| 10/8/19 | 60 | 110 | 205.632 | 300.384 | 325.872 | 1.046 | 10 | 550 | 40 | 0 | 0 | 0 | 0 |
| 10/9/19 | 60 | 120 | 205.632 | 300.384 | 325.872 | 1.046 | 10 | 570 | 60 | 0 | 0 | 0 | 0 |
| 10/10/19 | 60 | 120 | 205.632 | 300.384 | 325.872 | 1.046 | 10 | 670 | 90 | 0 | 0 | 0 | 0 |
| 10/11/19 | 50 | 120 | 205.632 | 300.384 | 325.872 | 1.046 | 10 | 840 | 100 | 0 | 0 | 0 | 0 |
| 10/12/19 | 50 | 120 | 205.632 | 300.384 | 325.872 | 1.046 | 10 | 610 | 130 | 0 | 0 | 0 | 0 |
| 10/13/19 | 50 | 120 | 205.632 | 300.384 | 325.872 | 1.046 | 10 | 440 | 130 | 0 | 0 | 0 | 0 |
| 10/14/19 | 50 | 120 | 205.632 | 300.384 | 325.872 | 1.046 | 10 | 340 | 150 | 0 | 0 | 0 | 0 |
| 10/15/19 | 60 | 120 | 205.632 | 300.384 | 325.872 | 1.046 | 10 | 230 | 110 | 0 | 17.066 | 0 | 0 |
| 10/16/19 | 60 | 120 | 205.632 | 300.384 | 325.872 | 1.046 | 10 | 420 | 90 | 0 | 0 | 0 | 0 |
| 10/17/19 | 50 | 120 | 205.632 | 300.384 | 325.872 | 1.046 | 10 | 330 | 90 | 0 | 0 | 0 | 0 |
| 10/18/19 | 50 | 120 | 205.632 | 300.384 | 325.872 | 1.046 | 10 | 530 | 90 | 0 | 0 | 0 | 0 |
| 10/19/19 | 50 | 120 | 205.632 | 300.384 | 325.872 | 1.046 | 10 | 470 | 50 | 0 | 0 | 0 | 0 |
| 10/20/19 | 50 | 120 | 205.632 | 300.384 | 325.872 | 1.046 | 10 | 150 | 80 | 0 | 0 | 0 | 0 |
| 10/21/19 | 50 | 120 | 205.632 | 300.384 | 325.872 | 1.046 | 10 | 180 | 70 | 0 | 67.066 | 0 | 0 |
| 10/22/19 | 50 | 120 | 205.632 | 300.384 | 325.872 | 1.046 | 10 | 170 | 80 | 0 | 117.066 | 0 | 0 |
| 10/23/19 | 60 | 120 | 205.632 | 300.384 | 325.872 | 1.046 | 10 | 170 | 80 | 0 | 51.309 | 65.757 | 0 |
| 10/24/19 | 50 | 120 | 205.632 | 300.384 | 325.872 | 1.046 | 10 | 270 | 70 | 0 | 0 | 47.066 | 0 |
| 10/25/19 | 50 | 120 | 205.632 | 300.384 | 325.872 | 1.046 | 10 | 530 | 90 | 0 | 0 | 0 | 0 |
| 10/26/19 | 50 | 120 | 205.632 | 300.384 | 325.872 | 1.046 | 10 | 720 | 110 | 0 | 0 | 0 | 0 |
| 10/27/19 | 40 | 130 | 205.632 | 300.384 | 325.872 | 1.046 | 10 | 640 | 70 | 0 | 0 | 0 | 0 |
| 10/28/19 | 40 | 120 | 205.632 | 300.384 | 325.872 | 1.046 | 10 | 290 | 80 | 0 | 7.066 | 0 | 0 |
| 10/29/19 | 50 | 120 | 205.632 | 300.384 | 325.872 | 1.046 | 10 | 140 | 70 | 0 | 187.066 | 0 | 0 |
| 10/30/19 | 50 | 120 | 205.632 | 300.384 | 325.872 | 1.046 | 10 | 130 | 90 | 0 | 41.309 | 125.757 | 0 |
| 10/31/19 | 50 | 120 | 205.632 | 300.384 | 325.872 | 1.046 | 10 | 190 | 120 | 0 | 0 | 0 | 0 |
| 11/1/19 | 50 | 130 | 205.632 | 300.384 | 325.872 | 1.046 | 10 | 430 | 40 | 0 | 0 | 0 | 0 |
| 11/2/19 | 40 | 130 | 205.632 | 300.384 | 325.872 | 1.046 | 10 | 600 | 50 | 0 | 0 | 0 | 0 |
| 11/3/19 | 40 | 120 | 205.632 | 300.384 | 325.872 | 1.046 | 10 | 310 | 40 | 0 | 0 | 0 | 0 |
| 11/4/19 | 40 | 120 | 205.632 | 300.384 | 325.872 | 1.046 | 10 | 270 | 50 | 0 | 57.066 | 0 | 0 |
| 11/5/19 | 50 | 120 | 205.632 | 300.384 | 325.872 | 1.046 | 10 | 220 | 40 | 0 | 147.066 | 0 | 0 |
| 11/6/19 | 60 | 120 | 205.632 | 300.384 | 325.872 | 1.046 | 10 | 110 | 40 | 0 | 31.309 | 215.757 | 0 |
| 11/7/19 | 50 | 120 | 205.632 | 300.384 | 325.872 | 1.046 | 10 | 290 | 60 | 0 | 0 | 77.066 | 0 |
| 11/8/19 | 50 | 120 | 205.632 | 300.384 | 325.872 | 1.046 | 10 | 160 | 40 | 0 | 0 | 197.066 | 0 |
| 11/9/19 | 50 | 120 | 205.632 | 300.384 | 325.872 | 1.046 | 10 | 160 | 40 | 0 | 0 | 0 | 0 |
| 11/10/19 | 50 | 130 | 205.632 | 300.384 | 325.872 | 1.046 | 10 | 140 | 70 | 0 | 0 | 0 | 0 |
| 11/11/19 | 40 | 130 | 205.632 | 300.384 | 325.872 | 1.046 | 10 | 420 | 40 | 0 | 0 | 0 | 0 |
| 11/12/19 | 50 | 130 | 205.632 | 300.384 | 325.872 | 1.046 | 10 | 530 | 40 | 0 | 0 | 0 | 0 |
| 11/13/19 | 50 | 130 | 205.632 | 300.384 | 325.872 | 1.046 | 10 | 360 | 30 | 0 | 47.066 | 0 | 0 |
| 11/14/19 | 50 | 130 | 205.632 | 300.384 | 325.872 | 1.046 | 10 | 340 | 80 | 0 | 0 | 0 | 0 |
| 11/15/19 | 50 | 130 | 205.632 | 300.384 | 325.872 | 1.046 | 10 | 500 | 30 | 0 | 0 | 0 | 0 |
| 11/16/19 | 50 | 130 | 205.632 | 300.384 | 325.872 | 1.046 | 10 | 320 | 40 | 0 | 0 | 0 | 0 |
| 11/17/19 | 50 | 130 | 205.632 | 300.384 | 325.872 | 1.046 | 10 | 310 | 20 | 0 | 0 | 0 | 0 |
| 11/18/19 | 60 | 130 | 205.632 | 300.384 | 325.872 | 1.046 | 10 | 400 | 30 | 0 | 0 | 0 | 0 |
| 11/19/19 | 50 | 130 | 205.632 | 300.384 | 325.872 | 1.046 | 10 | 420 | 40 | 0 | 17.066 | 0 | 0 |
| 11/20/19 | 60 | 130 | 205.632 | 300.384 | 325.872 | 1.046 | 10 | 40 | 20 | 0 | 218.374 | 128.691 | 0 |
| 11/21/19 | 50 | 130 | 205.632 | 300.384 | 325.872 | 1.046 | 10 | 130 | 20 | 0 | 0 | 287.066 | 0 |
| 11/22/19 | 50 | 130 | 205.632 | 300.384 | 325.872 | 1.046 | 10 | 270 | 30 | 0 | 0 | 137.066 | 0 |
| 11/23/19 | 40 | 130 | 205.632 | 300.384 | 325.872 | 1.046 | 10 | 630 | 50 | 0 | 0 | 0 | 0 |
| 11/24/19 | 40 | 130 | 205.632 | 300.384 | 325.872 | 1.046 | 10 | 320 | 40 | 0 | 0 | 0 | 0 |
| 11/25/19 | 50 | 130 | 205.632 | 300.384 | 325.872 | 1.046 | 10 | 60 | 20 | 0 | 235.44 | 101.626 | 0 |
| 11/26/19 | 50 | 130 | 205.632 | 300.384 | 325.872 | 1.046 | 10 | 230 | 30 | 0 | 0 | 197.066 | 0 |
| 11/27/19 | 40 | 130 | 205.632 | 300.384 | 325.872 | 1.046 | 10 | 540 | 20 | 0 | 0 | 0 | 0 |
| 11/28/19 | 40 | 130 | 205.632 | 300.384 | 325.872 | 1.046 | 10 | 870 | 30 | 0 | 0 | 0 | 0 |
| 11/29/19 | 50 | 130 | 205.632 | 300.384 | 325.872 | 1.046 | 10 | 650 | 40 | 0 | 0 | 0 | 0 |
| 11/30/19 | 50 | 130 | 205.632 | 300.384 | 325.872 | 1.046 | 10 | 210 | 50 | 0 | 0 | 0 | 0 |
| 12/1/19 | 50 | 130 | 205.632 | 300.384 | 325.872 | 1.046 | 10 | 130 | 20 | 0 | 17.066 | 0 | 0 |
| 12/2/19 | 50 | 130 | 205.632 | 300.384 | 325.872 | 1.046 | 10 | 350 | 40 | 0 | 7.066 | 0 | 0 |
| 12/3/19 | 60 | 130 | 205.632 | 300.384 | 325.872 | 1.046 | 10 | 270 | 40 | 0 | 157.066 | 0 | 0 |
| 12/4/19 | 50 | 130 | 205.632 | 300.384 | 325.872 | 1.046 | 10 | 290 | 70 | 0 | 54.243 | 72.822 | 0 |
| 12/5/19 | 50 | 130 | 205.632 | 300.384 | 325.872 | 1.046 | 10 | 420 | 50 | 0 | 0 | 67.066 | 0 |
| 12/6/19 | 50 | 130 | 205.632 | 300.384 | 325.872 | 1.046 | 10 | 860 | 40 | 0 | 0 | 0 | 0 |
| 12/7/19 | 40 | 130 | 205.632 | 300.384 | 325.872 | 1.046 | 10 | 860 | 20 | 0 | 0 | 0 | 0 |
| 12/8/19 | 40 | 130 | 205.632 | 300.384 | 325.872 | 1.046 | 10 | 930 | 30 | 0 | 0 | 0 | 0 |
| 12/9/19 | 40 | 130 | 205.632 | 300.384 | 325.872 | 1.046 | 10 | 770 | 30 | 0 | 0 | 0 | 0 |
| 12/10/19 | 50 | 130 | 205.632 | 300.384 | 325.872 | 1.046 | 10 | 560 | 50 | 0 | 0 | 0 | 0 |
| 12/11/19 | 50 | 130 | 205.632 | 300.384 | 325.872 | 1.046 | 10 | 470 | 20 | 0 | 67.066 | 0 | 0 |
| 12/12/19 | 50 | 130 | 205.632 | 300.384 | 325.872 | 1.046 | 10 | 390 | 20 | 0 | 107.066 | 0 | 0 |
| 12/13/19 | 50 | 130 | 205.632 | 300.384 | 325.872 | 1.046 | 10 | 570 | 20 | 0 | 0 | 0 | 0 |
| 12/14/19 | 50 | 130 | 205.632 | 300.384 | 325.872 | 1.046 | 10 | 840 | 30 | 0 | 0 | 0 | 0 |
| 12/15/19 | 40 | 130 | 205.632 | 300.384 | 325.872 | 1.046 | 10 | 880 | 30 | 0 | 0 | 0 | 0 |
| 12/16/19 | 40 | 130 | 205.632 | 300.384 | 325.872 | 1.046 | 10 | 460 | 30 | 0 | 0 | 0 | 0 |
| 12/17/19 | 40 | 130 | 205.632 | 300.384 | 325.872 | 1.046 | 10 | 530 | 40 | 0 | 0 | 0 | 0 |
| 12/18/19 | 50 | 130 | 205.632 | 300.384 | 325.872 | 1.046 | 10 | 430 | 30 | 0 | 0 | 0 | 0 |
| 12/19/19 | 40 | 130 | 205.632 | 300.384 | 325.872 | 1.046 | 10 | 560 | 50 | 0 | 0 | 0 | 0 |
| 12/20/19 | 40 | 130 | 205.632 | 300.384 | 325.872 | 1.046 | 10 | 660 | 30 | 0 | 0 | 0 | 0 |
| 12/21/19 | 40 | 130 | 205.632 | 300.384 | 325.872 | 1.046 | 10 | 440 | 40 | 0 | 0 | 0 | 0 |
| 12/22/19 | 50 | 130 | 205.632 | 300.384 | 325.872 | 1.046 | 10 | 420 | 20 | 0 | 0 | 0 | 0 |
| 12/23/19 | 50 | 130 | 205.632 | 300.384 | 325.872 | 1.046 | 10 | 620 | 20 | 0 | 0 | 0 | 0 |
| 12/24/19 | 50 | 130 | 205.632 | 300.384 | 325.872 | 1.046 | 10 | 470 | 20 | 0 | 0 | 0 | 0 |
| 12/25/19 | 50 | 130 | 205.632 | 300.384 | 325.872 | 1.046 | 10 | 300 | 20 | 0 | 0 | 0 | 0 |
| 12/26/19 | 60 | 130 | 205.632 | 300.384 | 325.872 | 1.046 | 10 | 140 | 30 | 0 | 0 | 0 | 0 |
| 12/27/19 | 50 | 130 | 205.632 | 300.384 | 325.872 | 1.046 | 10 | 150 | 20 | 0 | 0 | 0 | 0 |
| 12/28/19 | 50 | 130 | 205.632 | 300.384 | 325.872 | 1.046 | 10 | 160 | 40 | 0 | 0 | 0 | 0 |
| 12/29/19 | 50 | 130 | 205.632 | 300.384 | 325.872 | 1.046 | 10 | 340 | 60 | 0 | 0 | 0 | 0 |
| 12/30/19 | 40 | 130 | 205.632 | 300.384 | 325.872 | 1.046 | 10 | 670 | 60 | 0 | 0 | 0 | 0 |